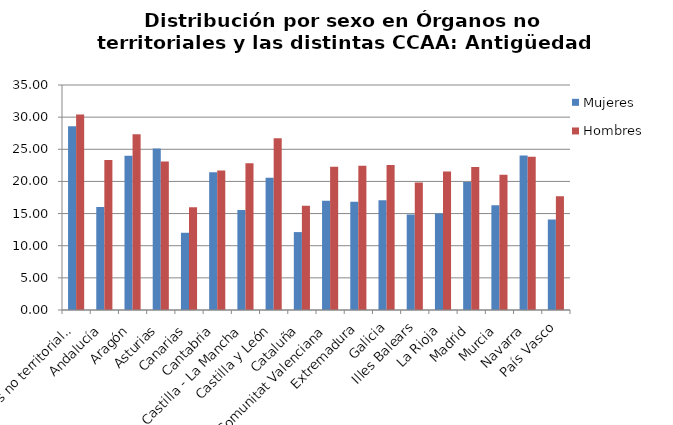
| Category | Mujeres | Hombres |
|---|---|---|
| Órganos no territoriales | 28.586 | 30.407 |
| Andalucía | 16.005 | 23.335 |
| Aragón | 24.006 | 27.341 |
| Asturias | 25.107 | 23.091 |
| Canarias | 12.014 | 15.976 |
| Cantabria | 21.422 | 21.708 |
| Castilla - La Mancha | 15.551 | 22.833 |
| Castilla y León | 20.553 | 26.701 |
| Cataluña | 12.12 | 16.233 |
| Comunitat Valenciana | 16.986 | 22.272 |
| Extremadura | 16.822 | 22.427 |
| Galicia | 17.06 | 22.574 |
| Illes Balears | 14.87 | 19.833 |
| La Rioja | 15.021 | 21.542 |
| Madrid | 19.908 | 22.235 |
| Murcia | 16.292 | 21.043 |
| Navarra | 24.022 | 23.847 |
| País Vasco | 14.065 | 17.7 |